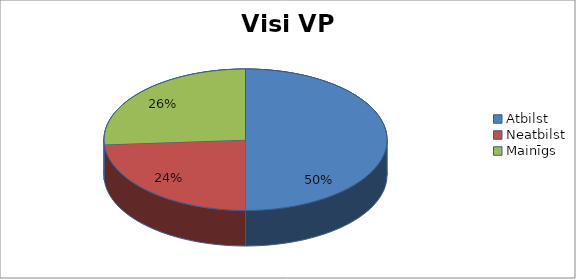
| Category | Series 0 |
|---|---|
| Atbilst | 23 |
| Neatbilst | 11 |
| Mainīgs | 12 |